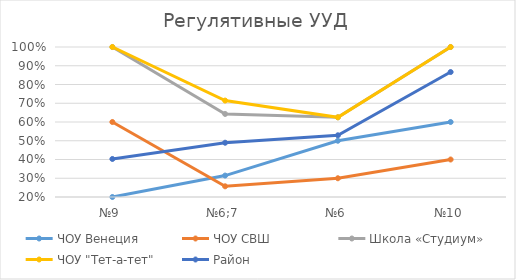
| Category | ЧОУ Венеция | ЧОУ СВШ | Школа «Студиум» | ЧОУ "Тет-а-тет" | Район |
|---|---|---|---|---|---|
| №9 | 0.2 | 0.6 | 1 | 1 | 0.403 |
| №6;7 | 0.314 | 0.257 | 0.643 | 0.714 | 0.489 |
| №6 | 0.5 | 0.3 | 0.625 | 0.625 | 0.529 |
| №10 | 0.6 | 0.4 | 1 | 1 | 0.866 |